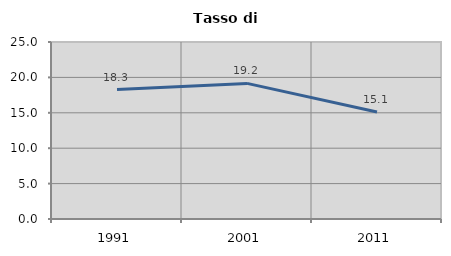
| Category | Tasso di disoccupazione   |
|---|---|
| 1991.0 | 18.284 |
| 2001.0 | 19.156 |
| 2011.0 | 15.106 |